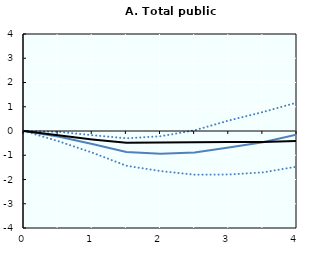
| Category | Effect during bust | confidence lower | confidence upper | Average effect |
|---|---|---|---|---|
| 0.0 | 0 | 0 | 0 | 0 |
| nan | -0.226 | -0.418 | -0.033 | -0.18 |
| 1.0 | -0.532 | -0.892 | -0.172 | -0.347 |
| nan | -0.868 | -1.434 | -0.301 | -0.485 |
| 2.0 | -0.934 | -1.652 | -0.216 | -0.47 |
| nan | -0.887 | -1.802 | 0.029 | -0.459 |
| 3.0 | -0.681 | -1.794 | 0.432 | -0.45 |
| nan | -0.462 | -1.706 | 0.781 | -0.456 |
| 4.0 | -0.148 | -1.469 | 1.173 | -0.408 |